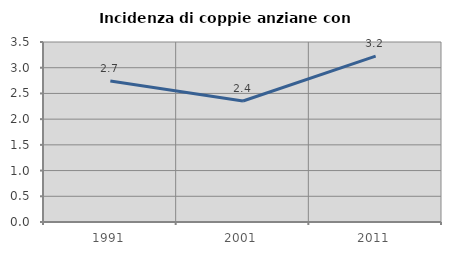
| Category | Incidenza di coppie anziane con figli |
|---|---|
| 1991.0 | 2.74 |
| 2001.0 | 2.353 |
| 2011.0 | 3.226 |